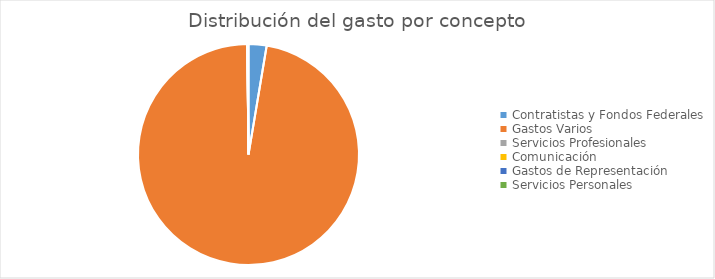
| Category | Series 0 |
|---|---|
| Contratistas y Fondos Federales | 5147737.46 |
| Gastos Varios | 189675572.91 |
| Servicios Profesionales | 0 |
| Comunicación | 0 |
| Gastos de Representación | 0 |
| Servicios Personales | 346369.62 |